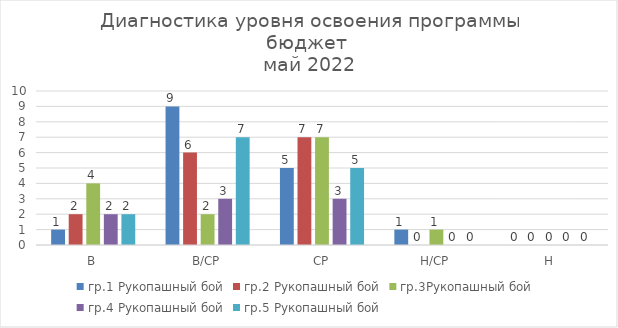
| Category | гр.1 Рукопашный бой | гр.2 Рукопашный бой | гр.3Рукопашный бой | гр.4 Рукопашный бой | гр.5 Рукопашный бой |
|---|---|---|---|---|---|
| В | 1 | 2 | 4 | 2 | 2 |
| В/СР | 9 | 6 | 2 | 3 | 7 |
| СР | 5 | 7 | 7 | 3 | 5 |
| Н/СР | 1 | 0 | 1 | 0 | 0 |
| Н | 0 | 0 | 0 | 0 | 0 |